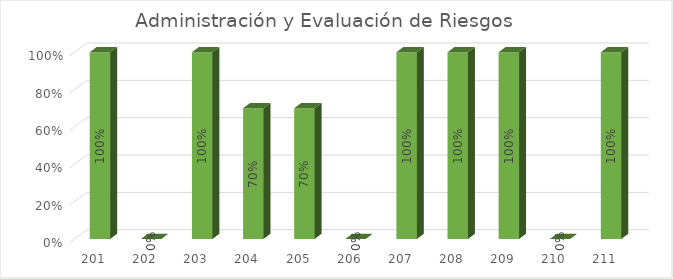
| Category | % Avance |
|---|---|
| 201.0 | 1 |
| 202.0 | 0 |
| 203.0 | 1 |
| 204.0 | 0.7 |
| 205.0 | 0.7 |
| 206.0 | 0 |
| 207.0 | 1 |
| 208.0 | 1 |
| 209.0 | 1 |
| 210.0 | 0 |
| 211.0 | 1 |